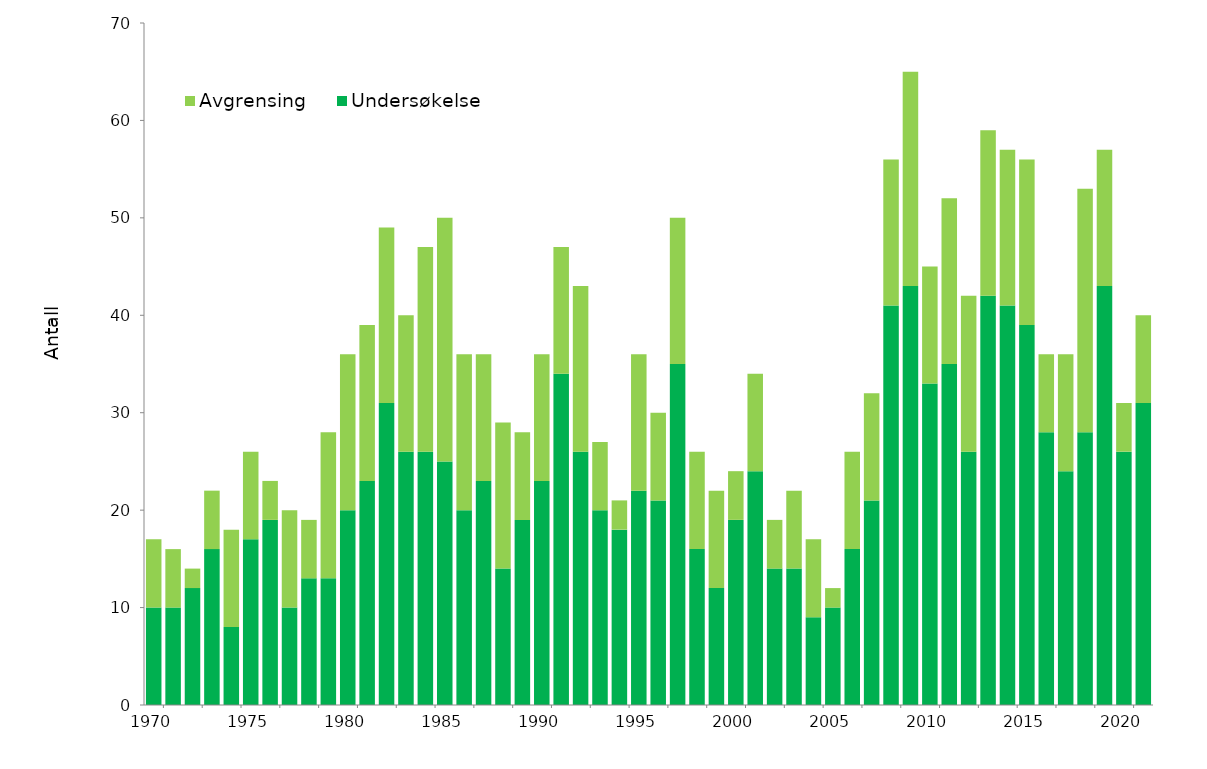
| Category | Undersøkelse | Avgrensing |
|---|---|---|
| 1970.0 | 10 | 7 |
| 1971.0 | 10 | 6 |
| 1972.0 | 12 | 2 |
| 1973.0 | 16 | 6 |
| 1974.0 | 8 | 10 |
| 1975.0 | 17 | 9 |
| 1976.0 | 19 | 4 |
| 1977.0 | 10 | 10 |
| 1978.0 | 13 | 6 |
| 1979.0 | 13 | 15 |
| 1980.0 | 20 | 16 |
| 1981.0 | 23 | 16 |
| 1982.0 | 31 | 18 |
| 1983.0 | 26 | 14 |
| 1984.0 | 26 | 21 |
| 1985.0 | 25 | 25 |
| 1986.0 | 20 | 16 |
| 1987.0 | 23 | 13 |
| 1988.0 | 14 | 15 |
| 1989.0 | 19 | 9 |
| 1990.0 | 23 | 13 |
| 1991.0 | 34 | 13 |
| 1992.0 | 26 | 17 |
| 1993.0 | 20 | 7 |
| 1994.0 | 18 | 3 |
| 1995.0 | 22 | 14 |
| 1996.0 | 21 | 9 |
| 1997.0 | 35 | 15 |
| 1998.0 | 16 | 10 |
| 1999.0 | 12 | 10 |
| 2000.0 | 19 | 5 |
| 2001.0 | 24 | 10 |
| 2002.0 | 14 | 5 |
| 2003.0 | 14 | 8 |
| 2004.0 | 9 | 8 |
| 2005.0 | 10 | 2 |
| 2006.0 | 16 | 10 |
| 2007.0 | 21 | 11 |
| 2008.0 | 41 | 15 |
| 2009.0 | 43 | 22 |
| 2010.0 | 33 | 12 |
| 2011.0 | 35 | 17 |
| 2012.0 | 26 | 16 |
| 2013.0 | 42 | 17 |
| 2014.0 | 41 | 16 |
| 2015.0 | 39 | 17 |
| 2016.0 | 28 | 8 |
| 2017.0 | 24 | 12 |
| 2018.0 | 28 | 25 |
| 2019.0 | 43 | 14 |
| 2020.0 | 26 | 5 |
| 2021.0 | 31 | 9 |